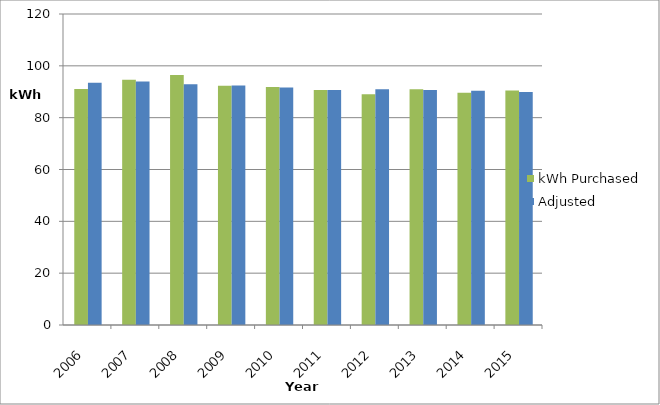
| Category | kWh Purchased | Adjusted |
|---|---|---|
| 2006.0 | 91018552.48 | 93449844.668 |
| 2007.0 | 94614050.2 | 93942700.906 |
| 2008.0 | 96430220.5 | 92897941.025 |
| 2009.0 | 92313324 | 92417554.56 |
| 2010.0 | 91831741 | 91685247.758 |
| 2011.0 | 90656017 | 90677202.941 |
| 2012.0 | 89014822 | 90986931.752 |
| 2013.0 | 90972832 | 90634800.771 |
| 2014.0 | 89574310 | 90361558.972 |
| 2015.0 | 90503010 | 89875095.826 |